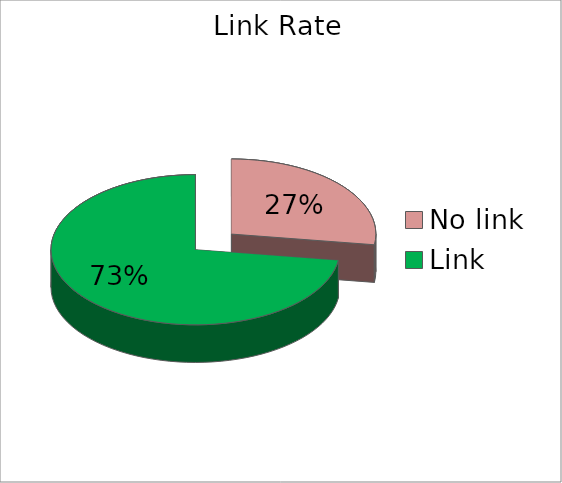
| Category | Series 0 |
|---|---|
| No link | 0.273 |
| Link | 0.727 |